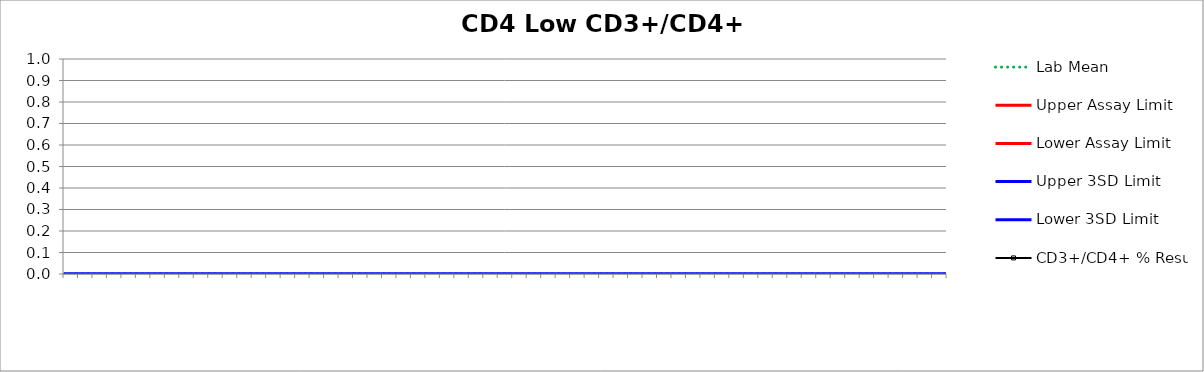
| Category | Lab Mean | Upper Assay Limit | Lower Assay Limit | Upper 3SD Limit | Lower 3SD Limit | CD3+/CD4+ % Result |
|---|---|---|---|---|---|---|
|  | 0 |  |  | 0 | 0 |  |
|  | 0 |  |  | 0 | 0 |  |
|  | 0 |  |  | 0 | 0 |  |
|  | 0 |  |  | 0 | 0 |  |
|  | 0 |  |  | 0 | 0 |  |
|  | 0 |  |  | 0 | 0 |  |
|  | 0 |  |  | 0 | 0 |  |
|  | 0 |  |  | 0 | 0 |  |
|  | 0 |  |  | 0 | 0 |  |
|  | 0 |  |  | 0 | 0 |  |
|  | 0 |  |  | 0 | 0 |  |
|  | 0 |  |  | 0 | 0 |  |
|  | 0 |  |  | 0 | 0 |  |
|  | 0 |  |  | 0 | 0 |  |
|  | 0 |  |  | 0 | 0 |  |
|  | 0 |  |  | 0 | 0 |  |
|  | 0 |  |  | 0 | 0 |  |
|  | 0 |  |  | 0 | 0 |  |
|  | 0 |  |  | 0 | 0 |  |
|  | 0 |  |  | 0 | 0 |  |
|  | 0 |  |  | 0 | 0 |  |
|  | 0 |  |  | 0 | 0 |  |
|  | 0 |  |  | 0 | 0 |  |
|  | 0 |  |  | 0 | 0 |  |
|  | 0 |  |  | 0 | 0 |  |
|  | 0 |  |  | 0 | 0 |  |
|  | 0 |  |  | 0 | 0 |  |
|  | 0 |  |  | 0 | 0 |  |
|  | 0 |  |  | 0 | 0 |  |
|  | 0 |  |  | 0 | 0 |  |
|  | 0 |  |  | 0 | 0 |  |
|  | 0 |  |  | 0 | 0 |  |
|  | 0 |  |  | 0 | 0 |  |
|  | 0 |  |  | 0 | 0 |  |
|  | 0 |  |  | 0 | 0 |  |
|  | 0 |  |  | 0 | 0 |  |
|  | 0 |  |  | 0 | 0 |  |
|  | 0 |  |  | 0 | 0 |  |
|  | 0 |  |  | 0 | 0 |  |
|  | 0 |  |  | 0 | 0 |  |
|  | 0 |  |  | 0 | 0 |  |
|  | 0 |  |  | 0 | 0 |  |
|  | 0 |  |  | 0 | 0 |  |
|  | 0 |  |  | 0 | 0 |  |
|  | 0 |  |  | 0 | 0 |  |
|  | 0 |  |  | 0 | 0 |  |
|  | 0 |  |  | 0 | 0 |  |
|  | 0 |  |  | 0 | 0 |  |
|  | 0 |  |  | 0 | 0 |  |
|  | 0 |  |  | 0 | 0 |  |
|  | 0 |  |  | 0 | 0 |  |
|  | 0 |  |  | 0 | 0 |  |
|  | 0 |  |  | 0 | 0 |  |
|  | 0 |  |  | 0 | 0 |  |
|  | 0 |  |  | 0 | 0 |  |
|  | 0 |  |  | 0 | 0 |  |
|  | 0 |  |  | 0 | 0 |  |
|  | 0 |  |  | 0 | 0 |  |
|  | 0 |  |  | 0 | 0 |  |
|  | 0 |  |  | 0 | 0 |  |
|  | 0 |  |  | 0 | 0 |  |
|  | 0 |  |  | 0 | 0 |  |